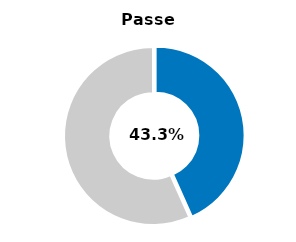
| Category | Series 0 |
|---|---|
| Passed | 0.433 |
| Other | 0.567 |